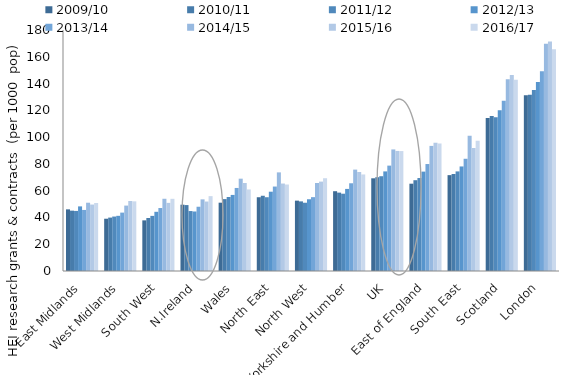
| Category | 2009/10 | 2010/11 | 2011/12 | 2012/13 | 2013/14 | 2014/15 | 2015/16 | 2016/17 |
|---|---|---|---|---|---|---|---|---|
| East Midlands | 46.041 | 45.075 | 44.863 | 48.26 | 45.598 | 50.996 | 49.621 | 50.784 |
| West Midlands | 39.043 | 39.887 | 40.665 | 41.211 | 43.608 | 48.854 | 52.302 | 52.021 |
| South West | 37.827 | 39.58 | 41.165 | 44.214 | 47.033 | 53.951 | 50.881 | 53.911 |
| N.Ireland | 49.526 | 49.239 | 44.783 | 44.446 | 47.997 | 53.511 | 51.882 | 55.916 |
| Wales | 51.028 | 53.691 | 55.282 | 56.823 | 62.019 | 68.957 | 65.723 | 60.912 |
| North East | 55.09 | 56.2 | 55.103 | 59.227 | 63.073 | 73.665 | 65.32 | 64.593 |
| North West | 52.549 | 51.999 | 50.987 | 53.585 | 55.152 | 65.738 | 66.765 | 69.289 |
| Yorkshire and Humber | 59.594 | 58.536 | 57.724 | 61.308 | 65.523 | 75.729 | 73.961 | 72.112 |
| UK | 69.239 | 70.039 | 70.791 | 74.386 | 78.704 | 90.8 | 89.66 | 89.581 |
| East of England | 65.209 | 67.817 | 69.44 | 74.232 | 79.89 | 93.436 | 95.72 | 95.235 |
| South East | 71.596 | 72.448 | 74.385 | 78.089 | 83.82 | 100.998 | 91.851 | 97.236 |
| Scotland | 114.27 | 115.739 | 114.778 | 119.981 | 127.067 | 143.163 | 146.341 | 142.817 |
| London | 131.225 | 131.672 | 135.205 | 141.17 | 149.236 | 169.648 | 171.37 | 165.674 |